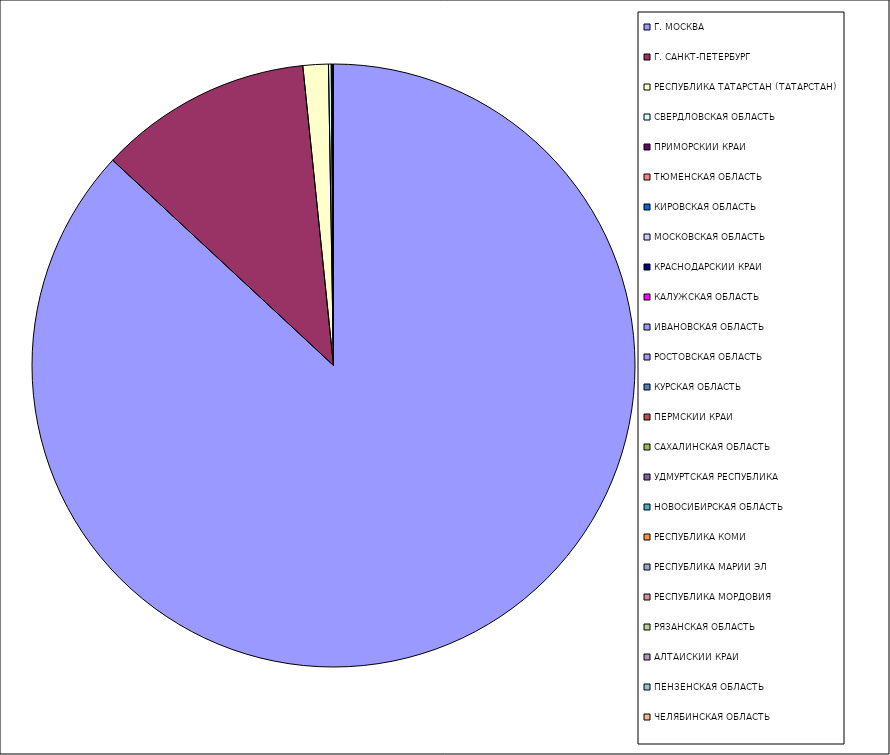
| Category | Оборот |
|---|---|
| Г. МОСКВА | 86.918 |
| Г. САНКТ-ПЕТЕРБУРГ | 11.454 |
| РЕСПУБЛИКА ТАТАРСТАН (ТАТАРСТАН) | 1.359 |
| СВЕРДЛОВСКАЯ ОБЛАСТЬ | 0.148 |
| ПРИМОРСКИЙ КРАЙ | 0.046 |
| ТЮМЕНСКАЯ ОБЛАСТЬ | 0.016 |
| КИРОВСКАЯ ОБЛАСТЬ | 0.01 |
| МОСКОВСКАЯ ОБЛАСТЬ | 0.008 |
| КРАСНОДАРСКИЙ КРАЙ | 0.006 |
| КАЛУЖСКАЯ ОБЛАСТЬ | 0.005 |
| ИВАНОВСКАЯ ОБЛАСТЬ | 0.005 |
| РОСТОВСКАЯ ОБЛАСТЬ | 0.004 |
| КУРСКАЯ ОБЛАСТЬ | 0.004 |
| ПЕРМСКИЙ КРАЙ | 0.003 |
| САХАЛИНСКАЯ ОБЛАСТЬ | 0.003 |
| УДМУРТСКАЯ РЕСПУБЛИКА | 0.002 |
| НОВОСИБИРСКАЯ ОБЛАСТЬ | 0.002 |
| РЕСПУБЛИКА КОМИ | 0.001 |
| РЕСПУБЛИКА МАРИЙ ЭЛ | 0.001 |
| РЕСПУБЛИКА МОРДОВИЯ | 0.001 |
| РЯЗАНСКАЯ ОБЛАСТЬ | 0.001 |
| АЛТАЙСКИЙ КРАЙ | 0 |
| ПЕНЗЕНСКАЯ ОБЛАСТЬ | 0 |
| ЧЕЛЯБИНСКАЯ ОБЛАСТЬ | 0 |